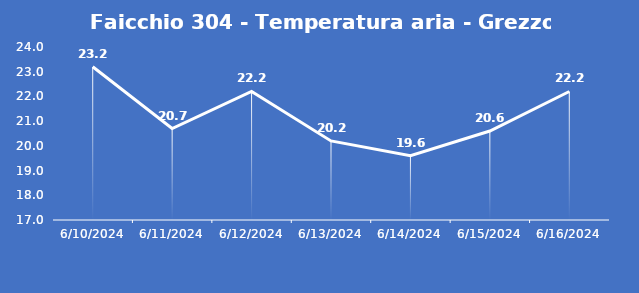
| Category | Faicchio 304 - Temperatura aria - Grezzo (°C) |
|---|---|
| 6/10/24 | 23.2 |
| 6/11/24 | 20.7 |
| 6/12/24 | 22.2 |
| 6/13/24 | 20.2 |
| 6/14/24 | 19.6 |
| 6/15/24 | 20.6 |
| 6/16/24 | 22.2 |